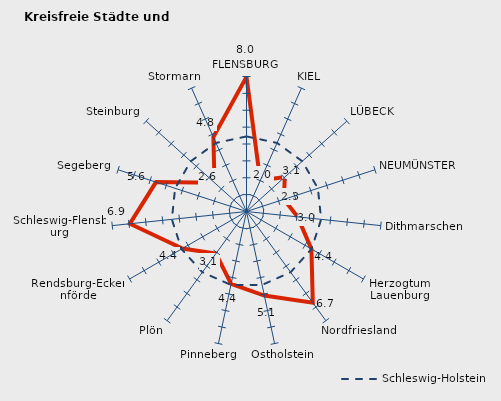
| Category | Kreise | Schleswig-Holstein |
|---|---|---|
| FLENSBURG | 7.976 | 4.448 |
| KIEL | 2.004 | 4.448 |
| LÜBECK | 3.051 | 4.448 |
| NEUMÜNSTER | 2.332 | 4.448 |
| Dithmarschen | 3.042 | 4.448 |
| Herzogtum Lauenburg | 4.442 | 4.448 |
| Nordfriesland | 6.684 | 4.448 |
| Ostholstein | 5.09 | 4.448 |
| Pinneberg | 4.385 | 4.448 |
| Plön | 3.081 | 4.448 |
| Rendsburg-Eckernförde | 4.384 | 4.448 |
| Schleswig-Flensburg | 6.947 | 4.448 |
| Segeberg | 5.638 | 4.448 |
| Steinburg | 2.553 | 4.448 |
| Stormarn | 4.825 | 4.448 |